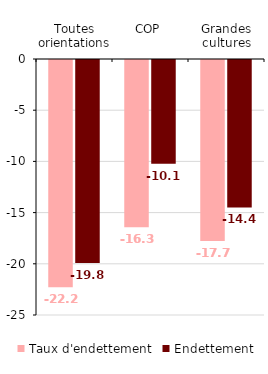
| Category | Taux d'endettement | Endettement |
|---|---|---|
| Toutes orientations | -22.19 | -19.83 |
| COP | -16.34 | -10.13 |
| Grandes cultures | -17.67 | -14.4 |